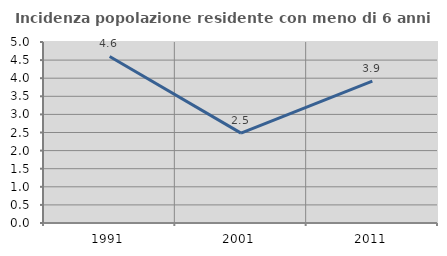
| Category | Incidenza popolazione residente con meno di 6 anni |
|---|---|
| 1991.0 | 4.6 |
| 2001.0 | 2.482 |
| 2011.0 | 3.922 |